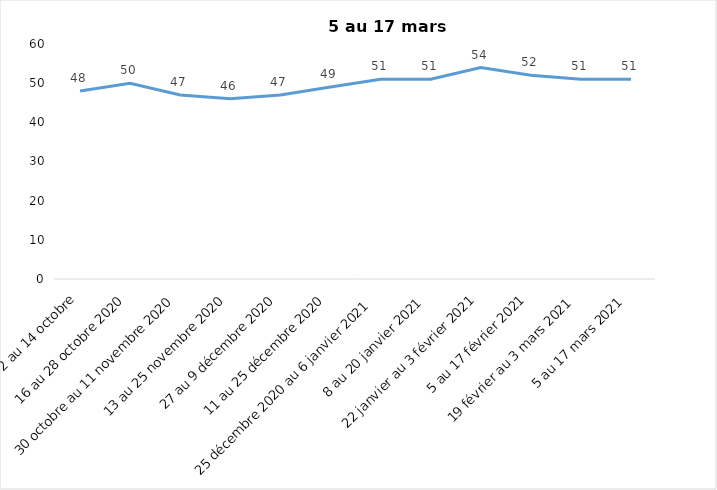
| Category | Toujours aux trois mesures |
|---|---|
| 2 au 14 octobre | 48 |
| 16 au 28 octobre 2020 | 50 |
| 30 octobre au 11 novembre 2020 | 47 |
| 13 au 25 novembre 2020 | 46 |
| 27 au 9 décembre 2020 | 47 |
| 11 au 25 décembre 2020 | 49 |
| 25 décembre 2020 au 6 janvier 2021 | 51 |
| 8 au 20 janvier 2021 | 51 |
| 22 janvier au 3 février 2021 | 54 |
| 5 au 17 février 2021 | 52 |
| 19 février au 3 mars 2021 | 51 |
| 5 au 17 mars 2021 | 51 |